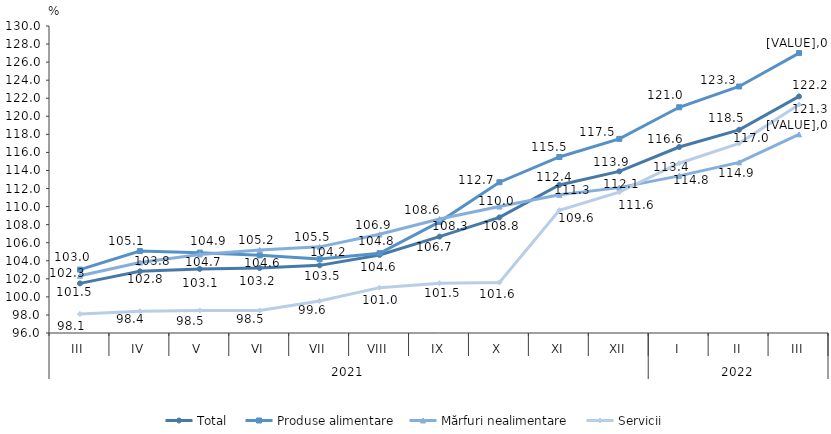
| Category | Total  | Produse alimentare | Mărfuri nealimentare  | Servicii |
|---|---|---|---|---|
| 0 | 101.493 | 103.024 | 102.337 | 98.107 |
| 1 | 102.826 | 105.075 | 103.801 | 98.417 |
| 2 | 103.1 | 104.9 | 104.7 | 98.5 |
| 3 | 103.2 | 104.6 | 105.2 | 98.5 |
| 4 | 103.49 | 104.2 | 105.54 | 99.55 |
| 5 | 104.645 | 104.834 | 106.928 | 101.023 |
| 6 | 106.675 | 108.308 | 108.624 | 101.521 |
| 7 | 108.8 | 112.7 | 110 | 101.6 |
| 8 | 112.4 | 115.494 | 111.3 | 109.6 |
| 9 | 113.9 | 117.5 | 112.1 | 111.6 |
| 10 | 116.6 | 121 | 113.4 | 114.8 |
| 11 | 118.5 | 123.3 | 114.9 | 117 |
| 12 | 122.2 | 127 | 118 | 121.3 |